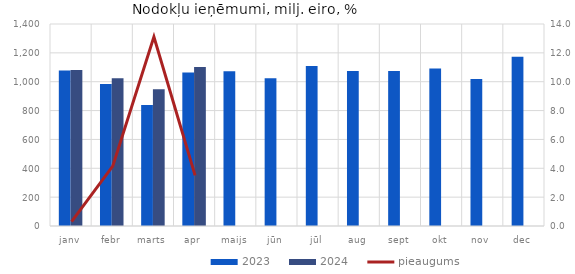
| Category | 2023 | 2024 |
|---|---|---|
| janv | 1077.163 | 1080.454 |
| febr | 983.504 | 1024.284 |
| marts | 838.446 | 948.367 |
| apr | 1063.867 | 1101.148 |
| maijs | 1071.795 | 0 |
| jūn | 1023.215 | 0 |
| jūl | 1108.668 | 0 |
| aug | 1074.853 | 0 |
| sept | 1074.819 | 0 |
| okt | 1092.402 | 0 |
| nov | 1019.074 | 0 |
| dec | 1172.609 | 0 |